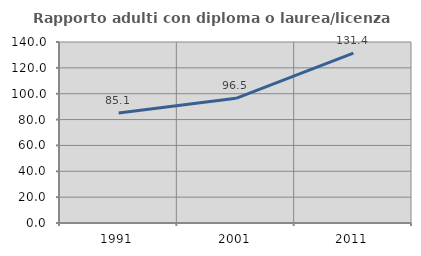
| Category | Rapporto adulti con diploma o laurea/licenza media  |
|---|---|
| 1991.0 | 85.111 |
| 2001.0 | 96.456 |
| 2011.0 | 131.364 |